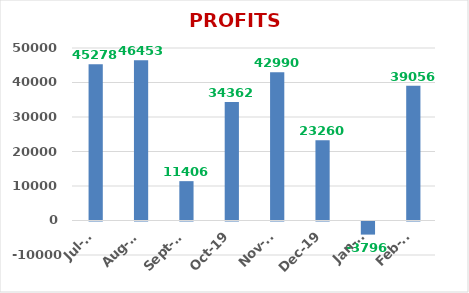
| Category | PROFITS (Rs.) |
|---|---|
| 2020-02-01 | 39056 |
| 2020-01-01 | -3796 |
| 2019-12-01 | 23260 |
| 2019-11-01 | 42990 |
| 2019-10-01 | 34362 |
| 2019-09-01 | 11406 |
| 2019-08-01 | 46453 |
| 2019-07-01 | 45278 |